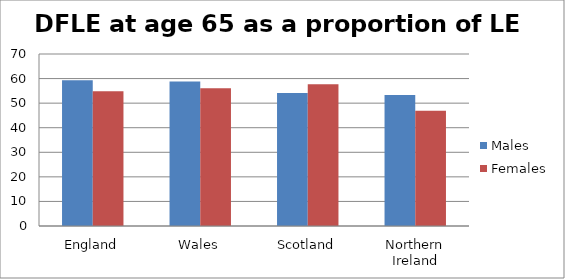
| Category | Males | Females |
|---|---|---|
| England | 59.277 | 54.801 |
| Wales | 58.857 | 56.027 |
| Scotland | 54.152 | 57.663 |
| Northern Ireland | 53.3 | 46.9 |